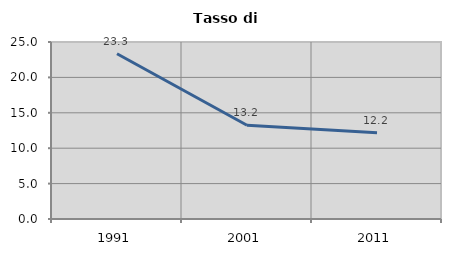
| Category | Tasso di disoccupazione   |
|---|---|
| 1991.0 | 23.333 |
| 2001.0 | 13.246 |
| 2011.0 | 12.167 |